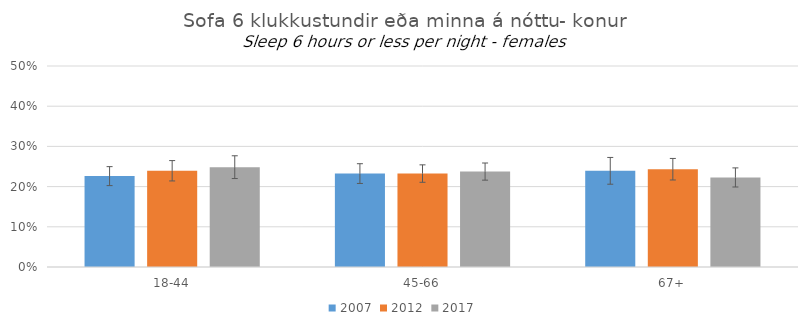
| Category | 2007 | 2012 | 2017 |
|---|---|---|---|
| 18-44 | 0.226 | 0.239 | 0.248 |
| 45-66 | 0.232 | 0.232 | 0.237 |
| 67+ | 0.239 | 0.243 | 0.223 |